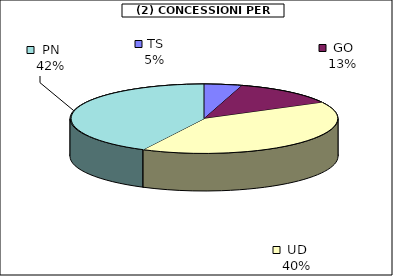
| Category | Series 0 |
|---|---|
| TS | 3761.125 |
| GO | 10420 |
| UD | 32925.5 |
| PN | 34802.5 |